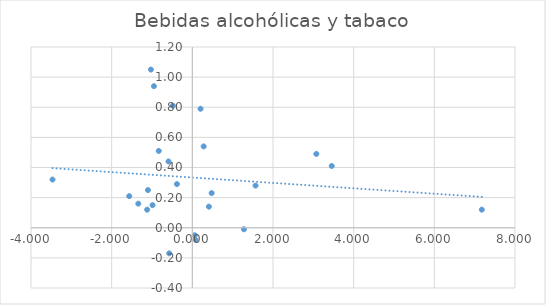
| Category | Bebidas alcohólicas y tabaco |
|---|---|
| 0.06052582200249956 | -0.05 |
| -1.339539147515001 | 0.16 |
| -1.1203229332582998 | 0.12 |
| -0.9862037445886013 | 0.15 |
| -3.4662710747771994 | 0.32 |
| 0.4103518494638997 | 0.14 |
| -1.5653149541481977 | 0.21 |
| 1.5673496706761991 | 0.28 |
| 7.1770364527009995 | 0.12 |
| 0.47884246635880034 | 0.23 |
| -0.832734952533401 | 0.51 |
| 3.4562493478376117 | 0.41 |
| 0.28079979651694786 | 0.54 |
| -0.5906758229193689 | 0.44 |
| -0.38208630553888956 | 0.29 |
| -0.5726169698249004 | -0.17 |
| 0.08025158798270066 | -0.08 |
| 1.2789830493301095 | -0.01 |
| -1.1005497828799102 | 0.25 |
| 0.20330044603610042 | 0.79 |
| -0.48222478231940147 | 0.81 |
| -0.9518304220709997 | 0.94 |
| -1.027059621055 | 1.05 |
| 3.074367518631871 | 0.49 |